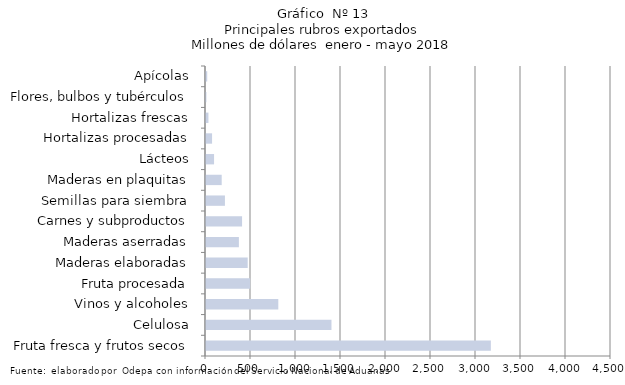
| Category | Series 7 |
|---|---|
| Fruta fresca y frutos secos | 3165076.66 |
| Celulosa | 1394102.795 |
| Vinos y alcoholes | 803256.159 |
| Fruta procesada | 491347.746 |
| Maderas elaboradas | 463360.258 |
| Maderas aserradas | 365369.385 |
| Carnes y subproductos | 400731.085 |
| Semillas para siembra | 210384.213 |
| Maderas en plaquitas | 174443.291 |
| Lácteos | 89452.142 |
| Hortalizas procesadas | 67311.508 |
| Hortalizas frescas | 26979.296 |
| Flores, bulbos y tubérculos | 4538.195 |
| Apícolas | 13602.522 |